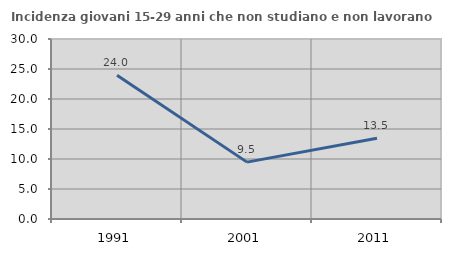
| Category | Incidenza giovani 15-29 anni che non studiano e non lavorano  |
|---|---|
| 1991.0 | 23.967 |
| 2001.0 | 9.479 |
| 2011.0 | 13.462 |